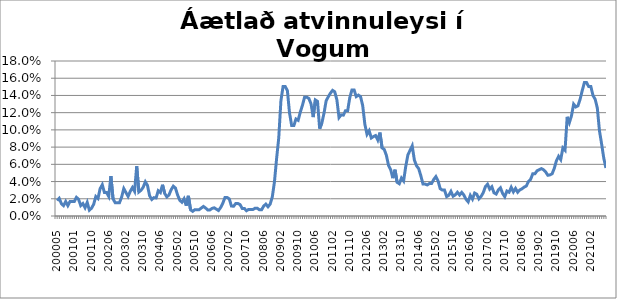
| Category | Series 0 |
|---|---|
| 200005 | 0.018 |
| 200006 | 0.02 |
| 200007 | 0.014 |
| 200008 | 0.012 |
| 200009 | 0.017 |
| 200010 | 0.012 |
| 200011 | 0.017 |
| 200012 | 0.017 |
| 200101 | 0.017 |
| 200102 | 0.022 |
| 200103 | 0.019 |
| 200104 | 0.012 |
| 200105 | 0.014 |
| 200106 | 0.01 |
| 200107 | 0.016 |
| 200109 | 0.007 |
| 200110 | 0.009 |
| 200111 | 0.014 |
| 200112 | 0.023 |
| 200201 | 0.02 |
| 200202 | 0.032 |
| 200203 | 0.036 |
| 200204 | 0.027 |
| 200205 | 0.027 |
| 200206 | 0.023 |
| 200207 | 0.046 |
| 200208 | 0.02 |
| 200209 | 0.015 |
| 200210 | 0.015 |
| 200211 | 0.015 |
| 200212 | 0.022 |
| 200301 | 0.032 |
| 200302 | 0.027 |
| 200303 | 0.023 |
| 200304 | 0.029 |
| 200305 | 0.033 |
| 200306 | 0.029 |
| 200307 | 0.058 |
| 200308 | 0.028 |
| 200309 | 0.03 |
| 200310 | 0.033 |
| 200311 | 0.04 |
| 200312 | 0.035 |
| 200401 | 0.023 |
| 200402 | 0.019 |
| 200403 | 0.021 |
| 200404 | 0.021 |
| 200405 | 0.029 |
| 200406 | 0.027 |
| 200407 | 0.036 |
| 200408 | 0.026 |
| 200409 | 0.022 |
| 200410 | 0.024 |
| 200411 | 0.031 |
| 200412 | 0.035 |
| 200501 | 0.032 |
| 200502 | 0.024 |
| 200503 | 0.018 |
| 200504 | 0.016 |
| 200505 | 0.02 |
| 200506 | 0.012 |
| 200507 | 0.023 |
| 200508 | 0.007 |
| 200509 | 0.005 |
| 200510 | 0.007 |
| 200511 | 0.007 |
| 200512 | 0.007 |
| 200601 | 0.009 |
| 200602 | 0.011 |
| 200603 | 0.009 |
| 200604 | 0.007 |
| 200605 | 0.007 |
| 200606 | 0.009 |
| 200607 | 0.01 |
| 200608 | 0.008 |
| 200609 | 0.006 |
| 200610 | 0.01 |
| 200611 | 0.015 |
| 200612 | 0.021 |
| 200701 | 0.022 |
| 200702 | 0.02 |
| 200703 | 0.012 |
| 200704 | 0.011 |
| 200705 | 0.014 |
| 200706 | 0.014 |
| 200707 | 0.013 |
| 200708 | 0.009 |
| 200709 | 0.009 |
| 200710 | 0.006 |
| 200711 | 0.008 |
| 200712 | 0.008 |
| 200801 | 0.008 |
| 200802 | 0.009 |
| 200803 | 0.009 |
| 200804 | 0.007 |
| 200805 | 0.007 |
| 200806 | 0.012 |
| 200807 | 0.014 |
| 200808 | 0.011 |
| 200809 | 0.014 |
| 200810 | 0.022 |
| 200811 | 0.04 |
| 200812 | 0.067 |
| 200901 | 0.091 |
| 200902 | 0.134 |
| 200903 | 0.15 |
| 200904 | 0.15 |
| 200905 | 0.146 |
| 200906 | 0.12 |
| 200907 | 0.105 |
| 200908 | 0.105 |
| 200909 | 0.113 |
| 200910 | 0.111 |
| 200911 | 0.121 |
| 200912 | 0.129 |
| 201001 | 0.138 |
| 201002 | 0.138 |
| 201003 | 0.136 |
| 201004 | 0.13 |
| 201005 | 0.115 |
| 201006 | 0.135 |
| 201007 | 0.133 |
| 201008 | 0.101 |
| 201009 | 0.108 |
| 201010 | 0.119 |
| 201011 | 0.134 |
| 201012 | 0.138 |
| 201101 | 0.143 |
| 201102 | 0.146 |
| 201103 | 0.144 |
| 201104 | 0.135 |
| 201105 | 0.114 |
| 201106 | 0.117 |
| 201107 | 0.117 |
| 201108 | 0.122 |
| 201109 | 0.122 |
| 201110 | 0.138 |
| 201111 | 0.146 |
| 201112 | 0.146 |
| 201201 | 0.139 |
| 201202 | 0.14 |
| 201203 | 0.139 |
| 201204 | 0.128 |
| 201205 | 0.106 |
| 201206 | 0.095 |
| 201207 | 0.099 |
| 201208 | 0.091 |
| 201209 | 0.092 |
| 201210 | 0.093 |
| 201211 | 0.088 |
| 201212 | 0.097 |
| 201301 | 0.079 |
| 201302 | 0.077 |
| 201303 | 0.07 |
| 201304 | 0.059 |
| 201305 | 0.054 |
| 201306 | 0.044 |
| 201307 | 0.054 |
| 201308 | 0.039 |
| 201309 | 0.037 |
| 201310 | 0.044 |
| 201311 | 0.041 |
| 201312 | 0.058 |
| 201401 | 0.071 |
| 201402 | 0.076 |
| 201403 | 0.081 |
| 201404 | 0.065 |
| 201405 | 0.058 |
| 201406 | 0.055 |
| 201407 | 0.047 |
| 201408 | 0.037 |
| 201409 | 0.037 |
| 201410 | 0.036 |
| 201411 | 0.038 |
| 201412 | 0.038 |
| 201501 | 0.042 |
| 201502 | 0.046 |
| 201503 | 0.041 |
| 201504 | 0.032 |
| 201505 | 0.03 |
| 201506 | 0.03 |
| 201507 | 0.023 |
| 201508 | 0.024 |
| 201509 | 0.029 |
| 201510 | 0.023 |
| 201511 | 0.025 |
| 201512 | 0.028 |
| 201601 | 0.024 |
| 201602 | 0.027 |
| 201603 | 0.024 |
| 201604 | 0.019 |
| 201605 | 0.016 |
| 201606 | 0.024 |
| 201607 | 0.02 |
| 201608 | 0.027 |
| 201609 | 0.025 |
| 201610 | 0.02 |
| 201611 | 0.023 |
| 201612 | 0.027 |
| 201701 | 0.034 |
| 201702 | 0.037 |
| 201703 | 0.031 |
| 201704 | 0.034 |
| 201705 | 0.027 |
| 201706 | 0.025 |
| 201707 | 0.03 |
| 201708 | 0.033 |
| 201709 | 0.026 |
| 201710 | 0.022 |
| 201711 | 0.029 |
| 201712 | 0.028 |
| 201801 | 0.033 |
| 201802 | 0.028 |
| 201803 | 0.032 |
| 201804 | 0.028 |
| 201805 | 0.03 |
| 201806 | 0.032 |
| 201807 | 0.034 |
| 201808 | 0.035 |
| 201809 | 0.04 |
| 201810 | 0.043 |
| 201811 | 0.049 |
| 201812 | 0.049 |
| 201901 | 0.052 |
| 201902 | 0.054 |
| 201903 | 0.055 |
| 201904 | 0.054 |
| 201905 | 0.051 |
| 201906 | 0.047 |
| 201907 | 0.048 |
| 201908 | 0.049 |
| 201909 | 0.055 |
| 201910 | 0.064 |
| 201911 | 0.069 |
| 201912 | 0.065 |
| 202001 | 0.079 |
| 202002 | 0.076 |
| 202003 | 0.115 |
| 202004 | 0.108 |
| 202005 | 0.116 |
| 202006 | 0.13 |
| 202007 | 0.127 |
| 202008 | 0.128 |
| 202009 | 0.136 |
| 202010 | 0.146 |
| 202011 | 0.155 |
| 202012 | 0.155 |
| 202101 | 0.15 |
| 202102 | 0.15 |
| 202103 | 0.14 |
| 202104 | 0.136 |
| 202105 | 0.125 |
| 202106 | 0.099 |
| 202107 | 0.084 |
| 202108 | 0.067 |
| 202109 | 0.056 |